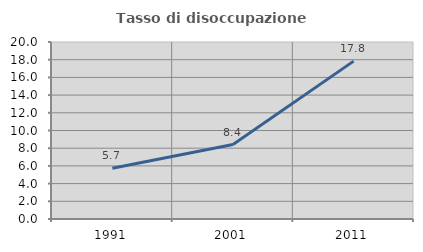
| Category | Tasso di disoccupazione giovanile  |
|---|---|
| 1991.0 | 5.744 |
| 2001.0 | 8.418 |
| 2011.0 | 17.84 |